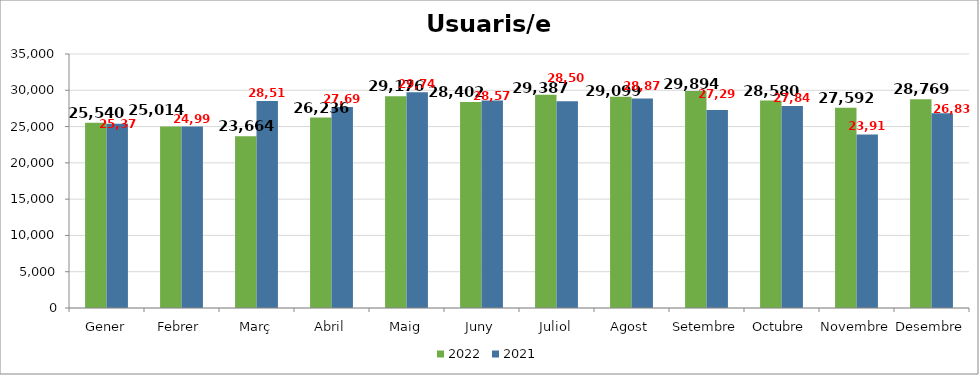
| Category | 2022 | 2021 |
|---|---|---|
| Gener | 25540 | 25375 |
| Febrer | 25014 | 24997 |
| Març | 23664 | 28514 |
| Abril | 26236 | 27698 |
| Maig | 29176 | 29740 |
| Juny | 28402 | 28579 |
| Juliol | 29387 | 28502 |
| Agost | 29099 | 28870 |
| Setembre | 29894 | 27292 |
| Octubre | 28580 | 27841 |
| Novembre | 27592 | 23919 |
| Desembre | 28769 | 26837 |